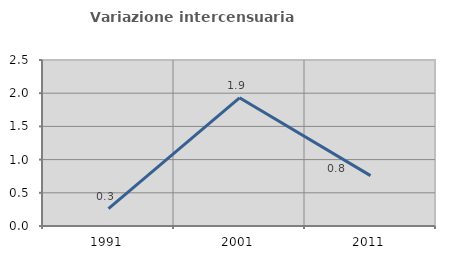
| Category | Variazione intercensuaria annua |
|---|---|
| 1991.0 | 0.262 |
| 2001.0 | 1.931 |
| 2011.0 | 0.759 |